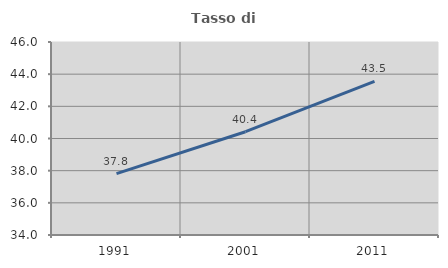
| Category | Tasso di occupazione   |
|---|---|
| 1991.0 | 37.815 |
| 2001.0 | 40.422 |
| 2011.0 | 43.549 |